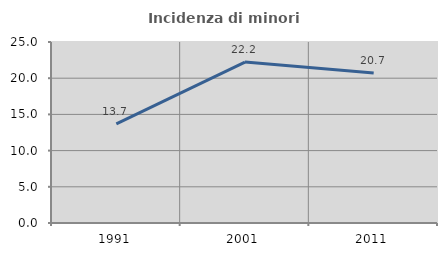
| Category | Incidenza di minori stranieri |
|---|---|
| 1991.0 | 13.699 |
| 2001.0 | 22.222 |
| 2011.0 | 20.706 |